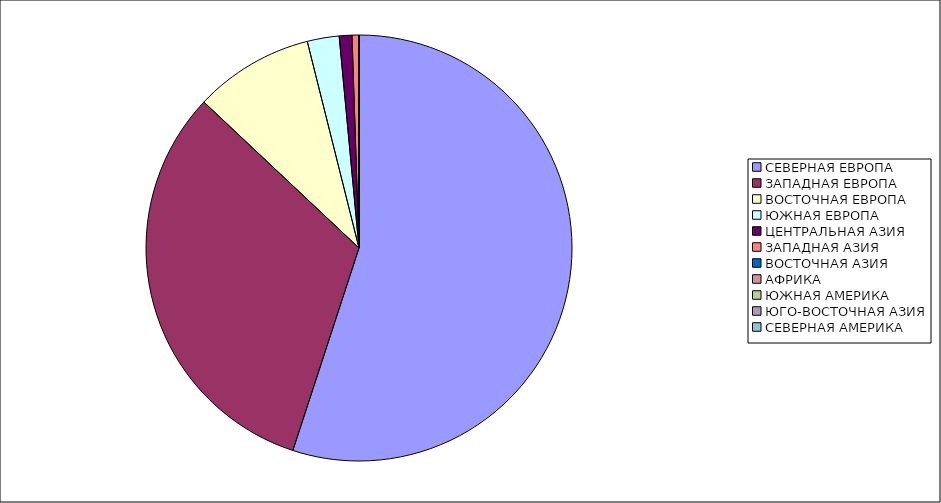
| Category | Оборот |
|---|---|
| СЕВЕРНАЯ ЕВРОПА | 55.026 |
| ЗАПАДНАЯ ЕВРОПА | 31.99 |
| ВОСТОЧНАЯ ЕВРОПА | 9.078 |
| ЮЖНАЯ ЕВРОПА | 2.419 |
| ЦЕНТРАЛЬНАЯ АЗИЯ | 0.961 |
| ЗАПАДНАЯ АЗИЯ | 0.494 |
| ВОСТОЧНАЯ АЗИЯ | 0.027 |
| АФРИКА | 0.003 |
| ЮЖНАЯ АМЕРИКА | 0.001 |
| ЮГО-ВОСТОЧНАЯ АЗИЯ | 0 |
| СЕВЕРНАЯ АМЕРИКА | 0 |